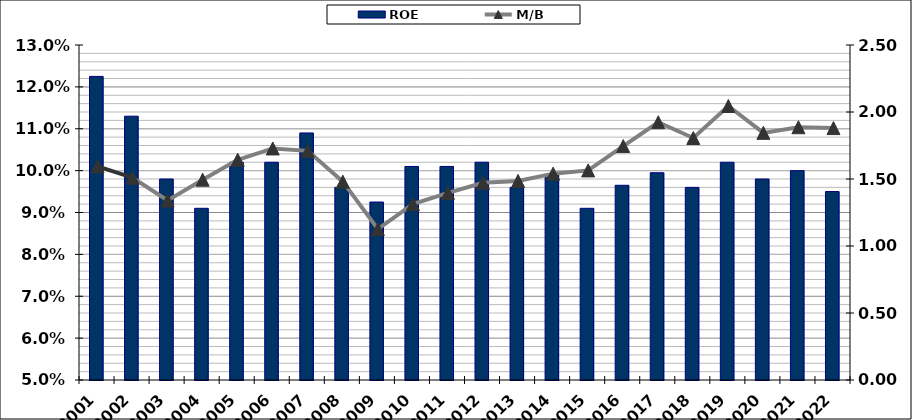
| Category | ROE |
|---|---|
| 2001.0 | 0.122 |
| 2002.0 | 0.113 |
| 2003.0 | 0.098 |
| 2004.0 | 0.091 |
| 2005.0 | 0.102 |
| 2006.0 | 0.102 |
| 2007.0 | 0.109 |
| 2008.0 | 0.096 |
| 2009.0 | 0.092 |
| 2010.0 | 0.101 |
| 2011.0 | 0.101 |
| 2012.0 | 0.102 |
| 2013.0 | 0.096 |
| 2014.0 | 0.099 |
| 2015.0 | 0.091 |
| 2016.0 | 0.096 |
| 2017.0 | 0.1 |
| 2018.0 | 0.096 |
| 2019.0 | 0.102 |
| 2020.0 | 0.098 |
| 2021.0 | 0.1 |
| 2022.0 | 0.095 |